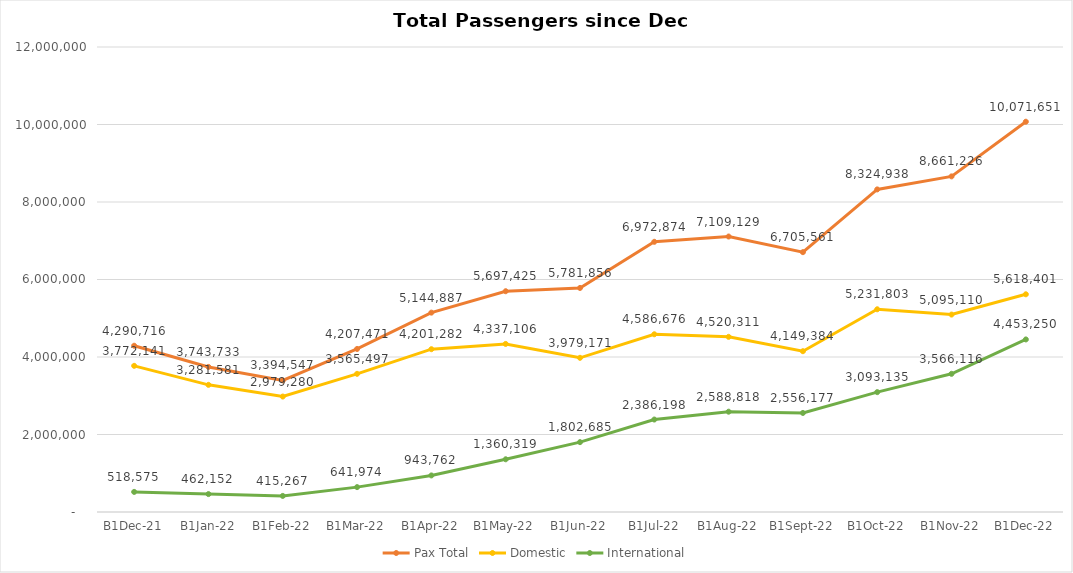
| Category | Pax Total |  Domestic  |  International  |
|---|---|---|---|
| 2021-12-01 | 4290716 | 3772141 | 518575 |
| 2022-01-01 | 3743733 | 3281581 | 462152 |
| 2022-02-01 | 3394547 | 2979280 | 415267 |
| 2022-03-01 | 4207471 | 3565497 | 641974 |
| 2022-04-01 | 5144887 | 4201282 | 943762 |
| 2022-05-01 | 5697425 | 4337106 | 1360319 |
| 2022-06-01 | 5781856 | 3979171 | 1802685 |
| 2022-07-01 | 6972874 | 4586676 | 2386198 |
| 2022-08-01 | 7109129 | 4520311 | 2588818 |
| 2022-09-01 | 6705561 | 4149384 | 2556177 |
| 2022-10-01 | 8324938 | 5231803 | 3093135 |
| 2022-11-01 | 8661226 | 5095110 | 3566116 |
| 2022-12-01 | 10071651 | 5618401 | 4453250 |